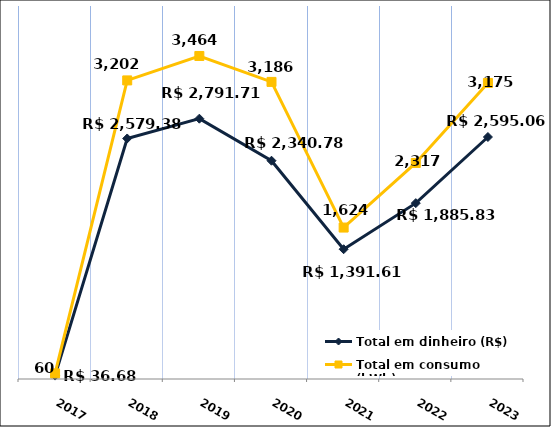
| Category | Total em dinheiro (R$) |
|---|---|
| 2017.0 | 36.68 |
| 2018.0 | 2579.38 |
| 2019.0 | 2791.71 |
| 2020.0 | 2340.78 |
| 2021.0 | 1391.61 |
| 2022.0 | 1885.83 |
| 2023.0 | 2595.06 |